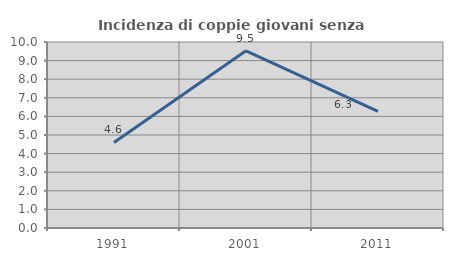
| Category | Incidenza di coppie giovani senza figli |
|---|---|
| 1991.0 | 4.598 |
| 2001.0 | 9.524 |
| 2011.0 | 6.275 |